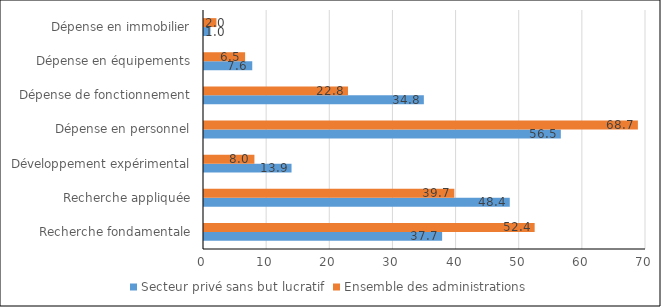
| Category | Secteur privé sans but lucratif | Ensemble des administrations |
|---|---|---|
| Recherche fondamentale | 37.712 | 52.365 |
| Recherche appliquée | 48.425 | 39.651 |
| Développement expérimental | 13.863 | 7.984 |
| Dépense en personnel | 56.512 | 68.715 |
| Dépense de fonctionnement | 34.818 | 22.803 |
| Dépense en équipements | 7.642 | 6.511 |
| Dépense en immobilier | 1.028 | 1.971 |